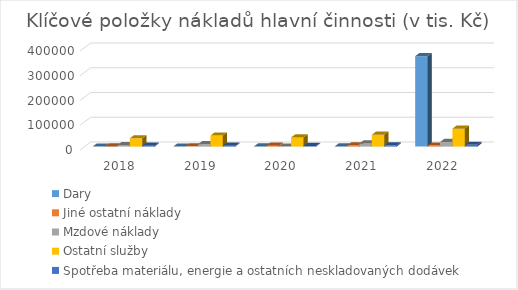
| Category | Dary | Jiné ostatní náklady | Mzdové náklady | Ostatní služby | Spotřeba materiálu, energie a ostatních neskladovaných dodávek |
|---|---|---|---|---|---|
| 2018.0 | 18 | 746 | 5856 | 33354 | 3363 |
| 2019.0 | 31 | 991 | 9399 | 44477 | 3144 |
| 2020.0 | 409 | 3315 | 0 | 37038 | 2657 |
| 2021.0 | 277 | 4222 | 12304 | 47685 | 4267 |
| 2022.0 | 365410 | 4042 | 18337 | 72395 | 7065 |